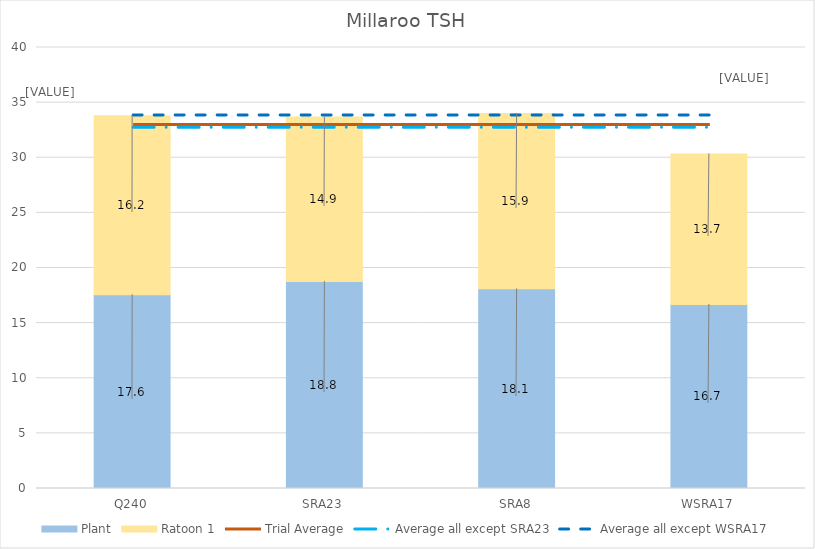
| Category | Plant | Ratoon 1 |
|---|---|---|
| Q240 | 17.582 | 16.238 |
| SRA23 | 18.768 | 14.917 |
| SRA8 | 18.108 | 15.898 |
| WSRA17 | 16.691 | 13.655 |